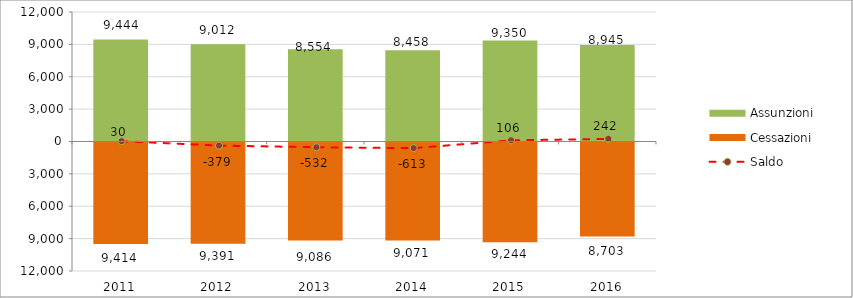
| Category | Assunzioni | Cessazioni |
|---|---|---|
| 2011.0 | 9444 | -9414 |
| 2012.0 | 9012 | -9391 |
| 2013.0 | 8554 | -9086 |
| 2014.0 | 8458 | -9071 |
| 2015.0 | 9350 | -9244 |
| 2016.0 | 8945 | -8703 |